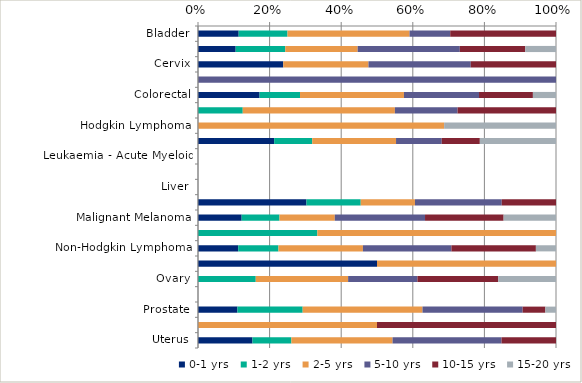
| Category | 0-1 yrs | 1-2 yrs | 2-5 yrs | 5-10 yrs | 10-15 yrs | 15-20 yrs |
|---|---|---|---|---|---|---|
| Bladder | 0.114 | 0.136 | 0.341 | 0.114 | 0.295 | 0 |
| Breast | 0.105 | 0.139 | 0.202 | 0.285 | 0.183 | 0.086 |
| Cervix | 0.238 | 0 | 0.238 | 0.286 | 0.238 | 0 |
| Central Nervous System (including Brain) | 0 | 0 | 0 | 1 | 0 | 0 |
| Colorectal | 0.172 | 0.113 | 0.29 | 0.21 | 0.151 | 0.065 |
| Head and Neck | 0 | 0.125 | 0.425 | 0.175 | 0.275 | 0 |
| Hodgkin Lymphoma | 0 | 0 | 0.688 | 0 | 0 | 0.312 |
| Kidney and unspecified urinary organs | 0.213 | 0.106 | 0.234 | 0.128 | 0.106 | 0.213 |
| Leukaemia - Acute Myeloid | 0 | 0 | 0 | 0 | 0 | 0 |
| Leukaemia - Chronic Lymphocytic | 0 | 0 | 0 | 0 | 0 | 0 |
| Liver | 0 | 0 | 0 | 0 | 0 | 0 |
| Lung | 0.303 | 0.152 | 0.152 | 0.242 | 0.152 | 0 |
| Malignant Melanoma | 0.122 | 0.106 | 0.154 | 0.252 | 0.22 | 0.146 |
| Multiple Myeloma | 0 | 0.333 | 0.667 | 0 | 0 | 0 |
| Non-Hodgkin Lymphoma | 0.112 | 0.112 | 0.236 | 0.247 | 0.236 | 0.056 |
| Oesophagus | 0.5 | 0 | 0.5 | 0 | 0 | 0 |
| Ovary | 0 | 0.161 | 0.258 | 0.194 | 0.226 | 0.161 |
| Pancreas | 0 | 0 | 0 | 0 | 0 | 0 |
| Prostate | 0.11 | 0.182 | 0.335 | 0.28 | 0.064 | 0.03 |
| Stomach | 0 | 0 | 0.5 | 0 | 0.5 | 0 |
| Uterus | 0.152 | 0.109 | 0.283 | 0.304 | 0.152 | 0 |